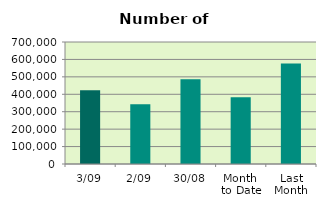
| Category | Series 0 |
|---|---|
| 3/09 | 422684 |
| 2/09 | 343334 |
| 30/08 | 486200 |
| Month 
to Date | 383009 |
| Last
Month | 576518.909 |